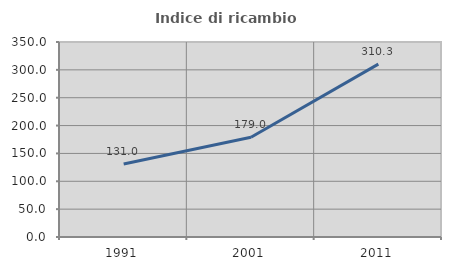
| Category | Indice di ricambio occupazionale  |
|---|---|
| 1991.0 | 131.02 |
| 2001.0 | 179.039 |
| 2011.0 | 310.326 |